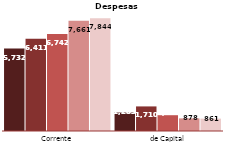
| Category | 2013 | 2014 | 2015 | 2016 | 2017 |
|---|---|---|---|---|---|
| Corrente | 5732 | 6411 | 6742 | 7661 | 7844 |
| de Capital | 1283 | 1710 | 1099 | 878 | 861 |